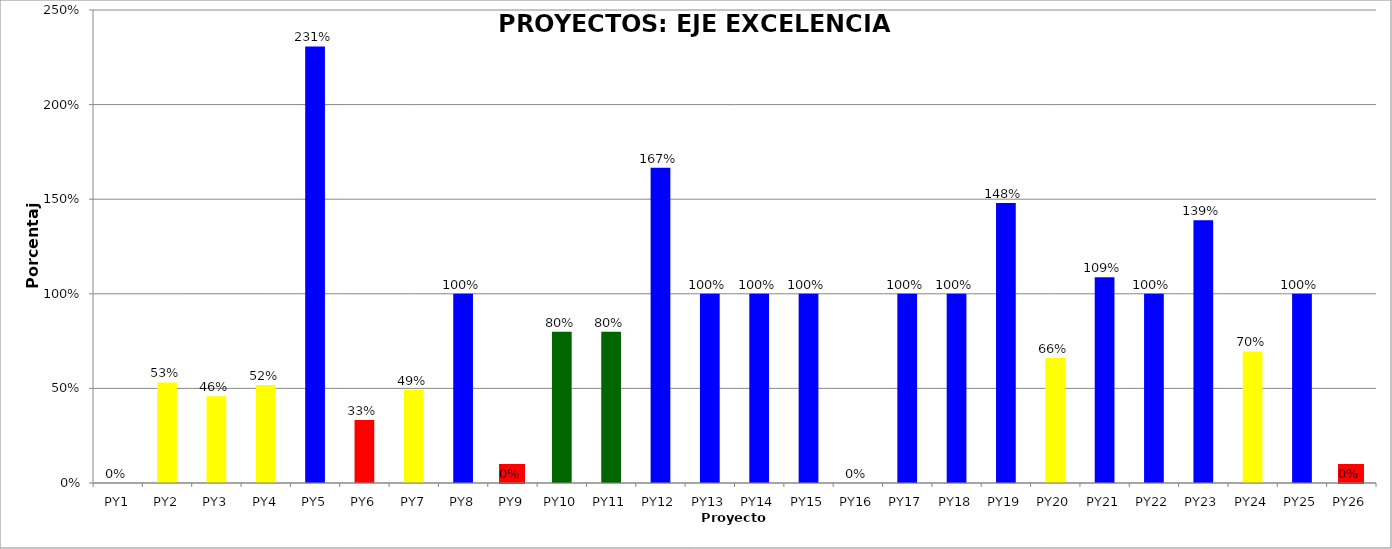
| Category | Series 0 |
|---|---|
| PY1 | 0 |
| PY2 | 0.532 |
| PY3 | 0.458 |
| PY4 | 0.519 |
| PY5 | 2.308 |
| PY6 | 0.333 |
| PY7 | 0.492 |
| PY8 | 1 |
| PY9 | 0 |
| PY10 | 0.8 |
| PY11 | 0.8 |
| PY12 | 1.667 |
| PY13 | 1 |
| PY14 | 1 |
| PY15 | 1 |
| PY16 | 0 |
| PY17 | 1 |
| PY18 | 1 |
| PY19 | 1.48 |
| PY20 | 0.66 |
| PY21 | 1.087 |
| PY22 | 1 |
| PY23 | 1.389 |
| PY24 | 0.695 |
| PY25 | 1 |
| PY26 | 0 |